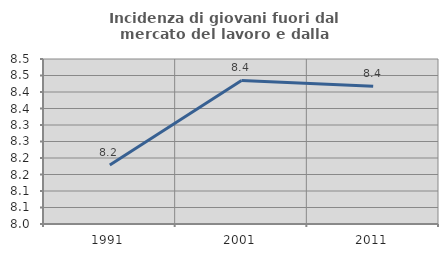
| Category | Incidenza di giovani fuori dal mercato del lavoro e dalla formazione  |
|---|---|
| 1991.0 | 8.179 |
| 2001.0 | 8.435 |
| 2011.0 | 8.417 |